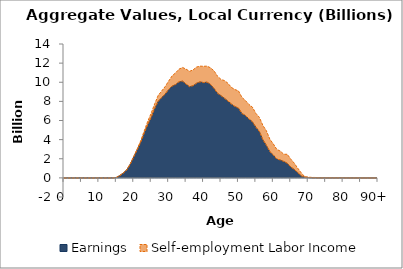
| Category | Earnings | Self-employment Labor Income |
|---|---|---|
| 0 | 0 | 0 |
|  | 0 | 0 |
| 2 | 0 | 0 |
| 3 | 0 | 0 |
| 4 | 0 | 0 |
| 5 | 0 | 0 |
| 6 | 0 | 0 |
| 7 | 0 | 0 |
| 8 | 0 | 0 |
| 9 | 0 | 0 |
| 10 | 0 | 0 |
| 11 | 0 | 0 |
| 12 | 0 | 0 |
| 13 | 0 | 0 |
| 14 | 5.482 | 0 |
| 15 | 41.386 | 1.966 |
| 16 | 243.184 | 3.926 |
| 17 | 510.079 | 6.374 |
| 18 | 844.484 | 11.626 |
| 19 | 1448.723 | 25.233 |
| 20 | 2207.18 | 35.854 |
| 21 | 2949.028 | 89.719 |
| 22 | 3731.758 | 154.145 |
| 23 | 4678.4 | 237.042 |
| 24 | 5560.568 | 351.684 |
| 25 | 6322.324 | 450.164 |
| 26 | 7258.07 | 493.611 |
| 27 | 8007.684 | 615.394 |
| 28 | 8403.297 | 682.701 |
| 29 | 8764.773 | 785.196 |
| 30 | 9237.344 | 888.256 |
| 31 | 9597.773 | 1074.527 |
| 32 | 9764.375 | 1226.34 |
| 33 | 10055.099 | 1321.82 |
| 34 | 10116.348 | 1427.376 |
| 35 | 9803.4 | 1563.907 |
| 36 | 9533.307 | 1610.775 |
| 37 | 9637.04 | 1657.239 |
| 38 | 9896.077 | 1692.492 |
| 39 | 10045.849 | 1636.89 |
| 40 | 9961.436 | 1708.649 |
| 41 | 10015.146 | 1668.114 |
| 42 | 9770.065 | 1737.911 |
| 43 | 9355.322 | 1837.477 |
| 44 | 8851.794 | 1783.592 |
| 45 | 8596.019 | 1696.998 |
| 46 | 8319.001 | 1856.611 |
| 47 | 8034.303 | 1854.028 |
| 48 | 7715.057 | 1738.227 |
| 49 | 7459.715 | 1775.662 |
| 50 | 7294.47 | 1806.03 |
| 51 | 6735.023 | 1683.018 |
| 52 | 6523.153 | 1566.568 |
| 53 | 6166.893 | 1510.741 |
| 54 | 5868.27 | 1530.139 |
| 55 | 5302.873 | 1440.409 |
| 56 | 4851.875 | 1475.671 |
| 57 | 3991.457 | 1495.743 |
| 58 | 3417.609 | 1514.947 |
| 59 | 2741.281 | 1307.029 |
| 60 | 2388.041 | 1160.013 |
| 61 | 1964.559 | 1011.646 |
| 62 | 1870.907 | 928.63 |
| 63 | 1713.849 | 756.436 |
| 64 | 1528.333 | 937.266 |
| 65 | 1131.694 | 829.654 |
| 66 | 885.447 | 651.589 |
| 67 | 547.973 | 458.189 |
| 68 | 208.583 | 324.202 |
| 69 | 70.27 | 49.452 |
| 70 | 37.751 | 43.476 |
| 71 | 10.977 | 37.916 |
| 72 | 10.82 | 30.943 |
| 73 | 3.285 | 15.223 |
| 74 | 2.69 | 13.046 |
| 75 | 0.587 | 10.086 |
| 76 | 1.456 | 15.28 |
| 77 | 1.423 | 13.546 |
| 78 | 2.227 | 13.582 |
| 79 | 2.101 | 13.342 |
| 80 | 1.798 | 15.099 |
| 81 | 0.734 | 6.773 |
| 82 | 0.706 | 5.768 |
| 83 | -0.002 | 4.63 |
| 84 | -0.002 | 4.175 |
| 85 | -0.001 | 1.545 |
| 86 | -0.001 | 1.269 |
| 87 | 0 | 1.152 |
| 88 | 0 | 0.251 |
| 89 | 0 | 0 |
| 90+ | 0 | 0 |